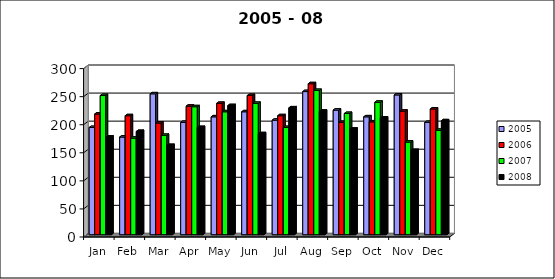
| Category | 2001 | 2004 | 2005 | 2006 | 2007 | 2008 |
|---|---|---|---|---|---|---|
| Jan |  |  | 191 | 215 | 248 | 174 |
| Feb |  |  | 174 | 212 | 172 | 184 |
| Mar |  |  | 251 | 199 | 177 | 159 |
| Apr |  |  | 200 | 229 | 228 | 191 |
| May |  |  | 210 | 234 | 219 | 230 |
| Jun |  |  | 219 | 248 | 234 | 180 |
| Jul |  |  | 204 | 212 | 191 | 226 |
| Aug |  |  | 255 | 269 | 257 | 220 |
| Sep |  |  | 222 | 200 | 216 | 188 |
| Oct |  |  | 210 | 201 | 236 | 208 |
| Nov |  |  | 249 | 220 | 165 | 150 |
| Dec |  |  | 200 | 224 | 186 | 203 |